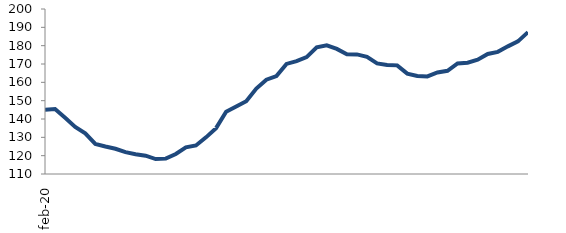
| Category | Series 1 |
|---|---|
| 2020-02-01 | 144.98 |
| 2020-03-01 | 145.471 |
| 2020-04-01 | 140.66 |
| 2020-05-01 | 135.678 |
| 2020-06-01 | 132.14 |
| 2020-07-01 | 126.404 |
| 2020-08-01 | 124.978 |
| 2020-09-01 | 123.76 |
| 2020-10-01 | 121.904 |
| 2020-11-01 | 120.729 |
| 2020-12-01 | 119.982 |
| 2021-01-01 | 118.16 |
| 2021-02-01 | 118.385 |
| 2021-03-01 | 120.897 |
| 2021-04-01 | 124.521 |
| 2021-05-01 | 125.561 |
| 2021-06-01 | 129.991 |
| 2021-07-01 | 135.036 |
| 2021-08-01 | 143.93 |
| 2021-09-01 | 146.816 |
| 2021-10-01 | 149.733 |
| 2021-11-01 | 156.598 |
| 2021-12-01 | 161.424 |
| 2022-01-01 | 163.409 |
| 2022-02-01 | 170.051 |
| 2022-03-01 | 171.561 |
| 2022-04-01 | 173.768 |
| 2022-05-01 | 179.049 |
| 2022-06-01 | 180.219 |
| 2022-07-01 | 178.235 |
| 2022-08-01 | 175.283 |
| 2022-09-01 | 175.244 |
| 2022-10-01 | 173.855 |
| 2022-11-01 | 170.303 |
| 2022-12-01 | 169.507 |
| 2023-01-01 | 169.264 |
| 2023-02-01 | 164.751 |
| 2023-03-01 | 163.49 |
| 2023-04-01 | 163.213 |
| 2023-05-01 | 165.362 |
| 2023-06-01 | 166.293 |
| 2023-07-01 | 170.283 |
| 2023-08-01 | 170.701 |
| 2023-09-01 | 172.319 |
| 2023-10-01 | 175.469 |
| 2023-11-01 | 176.617 |
| 2023-12-01 | 179.624 |
| 2024-01-01 | 182.352 |
| 2024-02-01 | 187.38 |